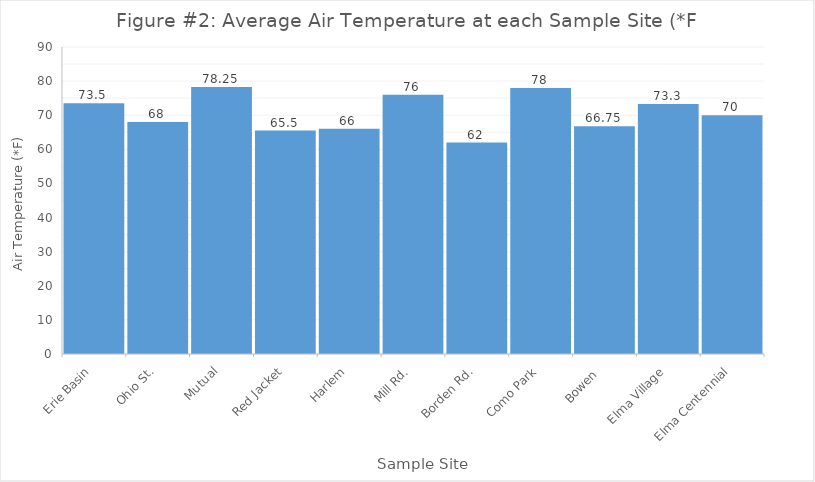
| Category | Series 0 |
|---|---|
| Erie Basin | 73.5 |
| Ohio St. | 68 |
| Mutual | 78.25 |
| Red Jacket | 65.5 |
| Harlem | 66 |
| Mill Rd. | 76 |
| Borden Rd. | 62 |
| Como Park | 78 |
| Bowen  | 66.75 |
| Elma Village | 73.3 |
| Elma Centennial | 70 |